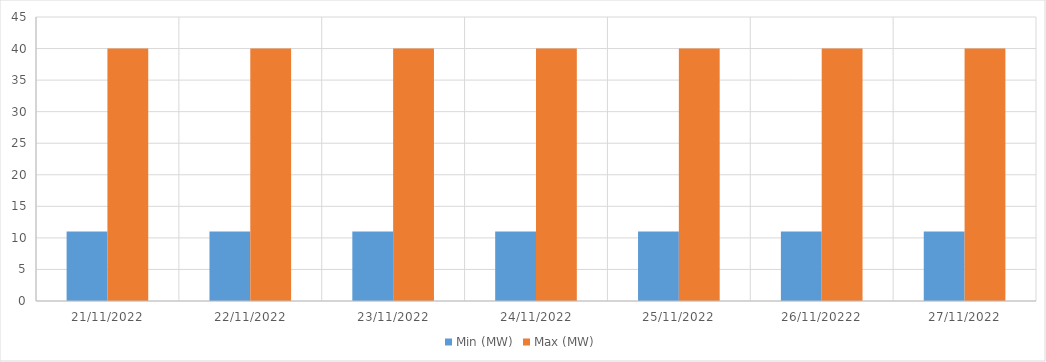
| Category | Min (MW) | Max (MW) |
|---|---|---|
| 21/11/2022 | 11 | 40 |
| 22/11/2022 | 11 | 40 |
| 23/11/2022 | 11 | 40 |
| 24/11/2022 | 11 | 40 |
| 25/11/2022 | 11 | 40 |
| 26/11/20222 | 11 | 40 |
| 27/11/2022 | 11 | 40 |